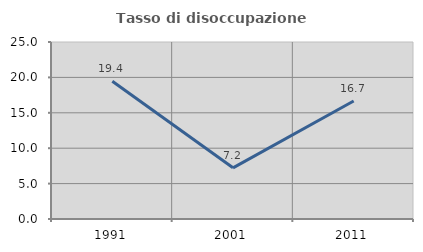
| Category | Tasso di disoccupazione giovanile  |
|---|---|
| 1991.0 | 19.444 |
| 2001.0 | 7.229 |
| 2011.0 | 16.667 |